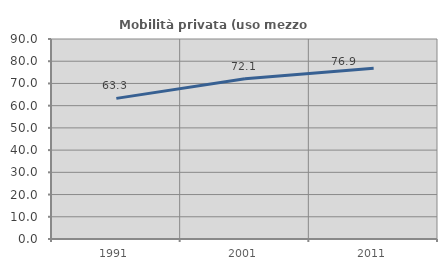
| Category | Mobilità privata (uso mezzo privato) |
|---|---|
| 1991.0 | 63.285 |
| 2001.0 | 72.138 |
| 2011.0 | 76.867 |